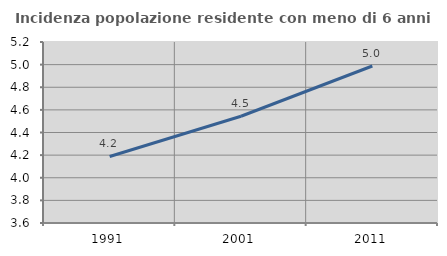
| Category | Incidenza popolazione residente con meno di 6 anni |
|---|---|
| 1991.0 | 4.188 |
| 2001.0 | 4.544 |
| 2011.0 | 4.988 |